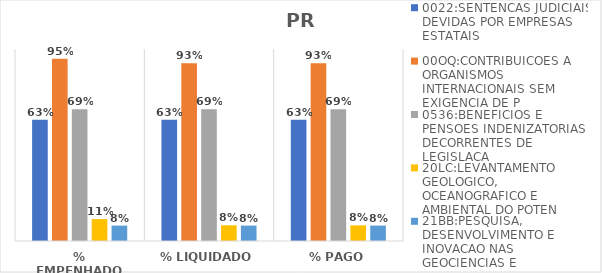
| Category | 0022:SENTENCAS JUDICIAIS DEVIDAS POR EMPRESAS ESTATAIS | 00OQ:CONTRIBUICOES A ORGANISMOS INTERNACIONAIS SEM EXIGENCIA DE P | 0536:BENEFICIOS E PENSOES INDENIZATORIAS DECORRENTES DE LEGISLACA | 20LC:LEVANTAMENTO GEOLOGICO, OCEANOGRAFICO E AMBIENTAL DO POTEN | 21BB:PESQUISA, DESENVOLVIMENTO E INOVACAO NAS GEOCIENCIAS E |
|---|---|---|---|---|---|
| % EMPENHADO | 0.631 | 0.95 | 0.687 | 0.114 | 0.08 |
| % LIQUIDADO | 0.631 | 0.926 | 0.687 | 0.082 | 0.08 |
| % PAGO | 0.631 | 0.926 | 0.687 | 0.082 | 0.08 |